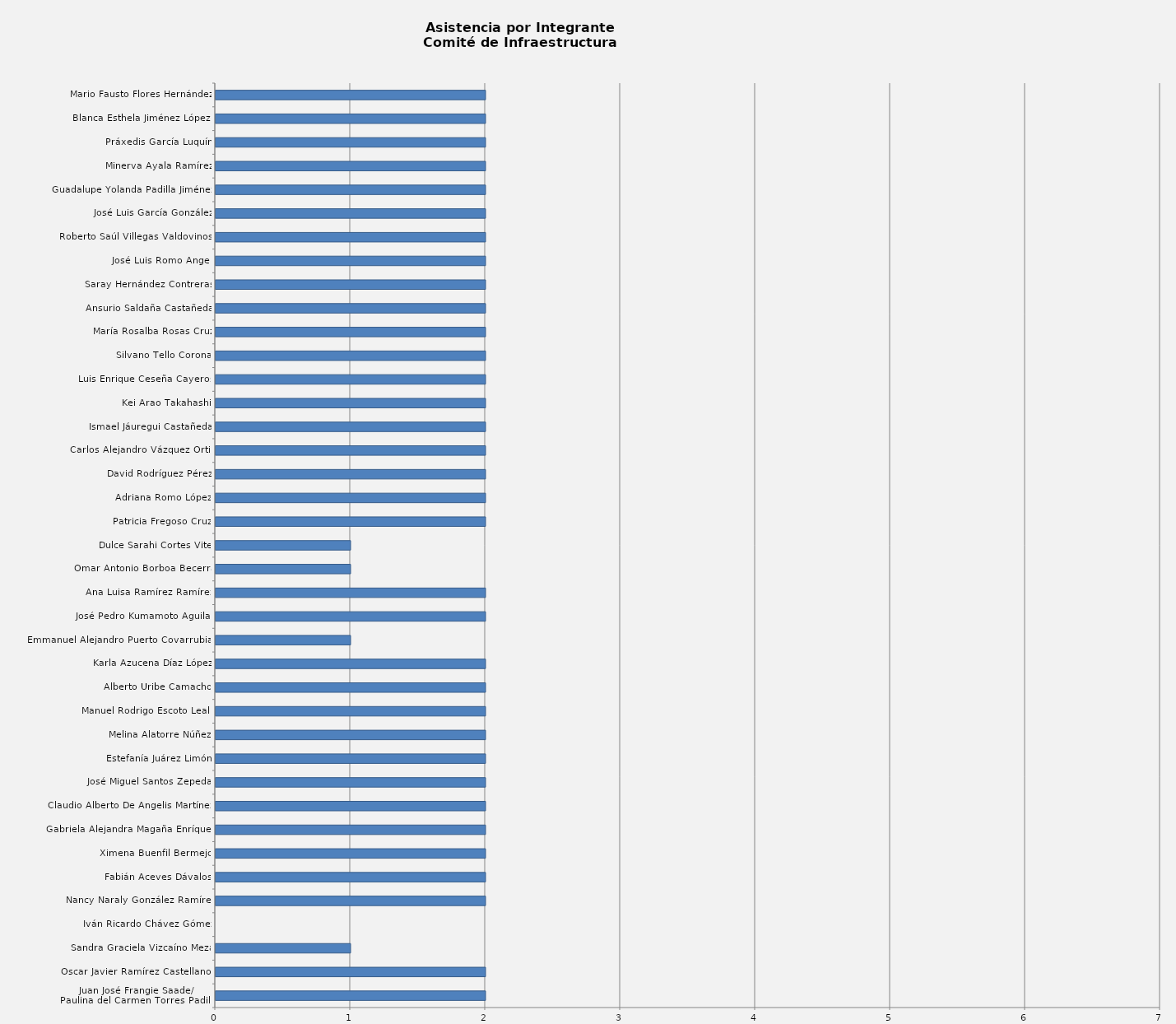
| Category | Series 0 |
|---|---|
| Juan José Frangie Saade/
Paulina del Carmen Torres Padilla | 2 |
| Oscar Javier Ramírez Castellanos | 2 |
| Sandra Graciela Vizcaíno Meza | 1 |
| Iván Ricardo Chávez Gómez | 0 |
| Nancy Naraly González Ramírez | 2 |
| Fabián Aceves Dávalos | 2 |
| Ximena Buenfil Bermejo | 2 |
| Gabriela Alejandra Magaña Enríquez | 2 |
| Claudio Alberto De Angelis Martínez | 2 |
| José Miguel Santos Zepeda | 2 |
| Estefanía Juárez Limón | 2 |
| Melina Alatorre Núñez | 2 |
| Manuel Rodrigo Escoto Leal  | 2 |
| Alberto Uribe Camacho | 2 |
| Karla Azucena Díaz López | 2 |
| Emmanuel Alejandro Puerto Covarrubias | 1 |
| José Pedro Kumamoto Aguilar | 2 |
| Ana Luisa Ramírez Ramírez | 2 |
| Omar Antonio Borboa Becerra | 1 |
| Dulce Sarahi Cortes Vite | 1 |
| Patricia Fregoso Cruz | 2 |
| Adriana Romo López | 2 |
| David Rodríguez Pérez | 2 |
| Carlos Alejandro Vázquez Ortiz | 2 |
| Ismael Jáuregui Castañeda | 2 |
| Kei Arao Takahashi | 2 |
| Luis Enrique Ceseña Cayeros | 2 |
| Silvano Tello Corona | 2 |
| María Rosalba Rosas Cruz | 2 |
| Ansurio Saldaña Castañeda | 2 |
| Saray Hernández Contreras | 2 |
| José Luis Romo Ángel | 2 |
| Roberto Saúl Villegas Valdovinos  | 2 |
| José Luis García González | 2 |
| Guadalupe Yolanda Padilla Jiménez | 2 |
| Minerva Ayala Ramírez | 2 |
| Práxedis García Luquín | 2 |
| Blanca Esthela Jiménez López  | 2 |
| Mario Fausto Flores Hernández | 2 |